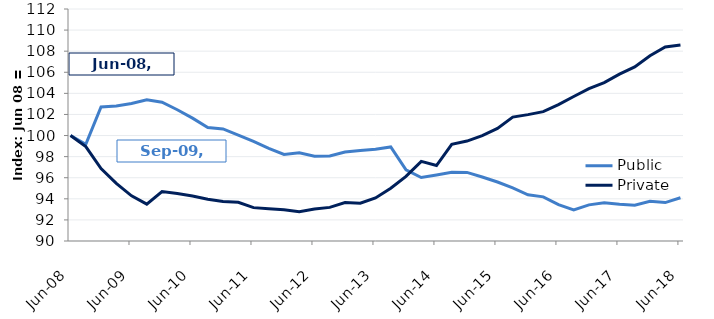
| Category | Public |
|---|---|
| 2008-06-01 | 100 |
| 2008-09-01 | 99.168 |
| 2008-12-01 | 102.704 |
| 2009-03-01 | 102.795 |
| 2009-06-01 | 103.041 |
| 2009-09-01 | 103.397 |
| 2009-12-01 | 103.163 |
| 2010-03-01 | 102.446 |
| 2010-06-01 | 101.652 |
| 2010-09-01 | 100.757 |
| 2010-12-01 | 100.624 |
| 2011-03-01 | 100.041 |
| 2011-06-01 | 99.436 |
| 2011-09-01 | 98.792 |
| 2011-12-01 | 98.211 |
| 2012-03-01 | 98.366 |
| 2012-06-01 | 98.032 |
| 2012-09-01 | 98.062 |
| 2012-12-01 | 98.434 |
| 2013-03-01 | 98.588 |
| 2013-06-01 | 98.692 |
| 2013-09-01 | 98.922 |
| 2013-12-01 | 96.744 |
| 2014-03-01 | 96.022 |
| 2014-06-01 | 96.256 |
| 2014-09-01 | 96.508 |
| 2014-12-01 | 96.504 |
| 2015-03-01 | 96.069 |
| 2015-06-01 | 95.594 |
| 2015-09-01 | 95.034 |
| 2015-12-01 | 94.385 |
| 2016-03-01 | 94.187 |
| 2016-06-01 | 93.443 |
| 2016-09-01 | 92.952 |
| 2016-12-01 | 93.426 |
| 2017-03-01 | 93.634 |
| 2017-06-01 | 93.483 |
| 2017-09-01 | 93.402 |
| 2017-12-01 | 93.768 |
| 2018-03-01 | 93.642 |
| 2018-06-01 | 94.102 |